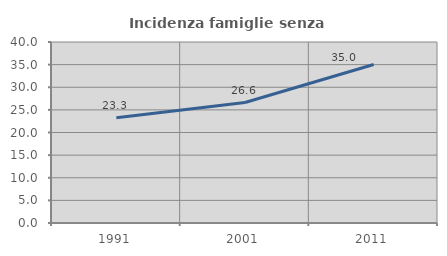
| Category | Incidenza famiglie senza nuclei |
|---|---|
| 1991.0 | 23.284 |
| 2001.0 | 26.624 |
| 2011.0 | 35.036 |